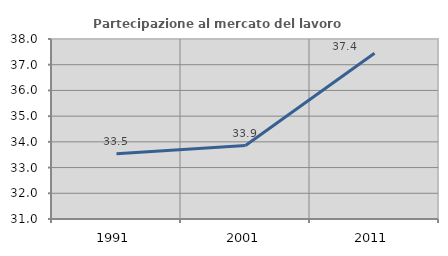
| Category | Partecipazione al mercato del lavoro  femminile |
|---|---|
| 1991.0 | 33.534 |
| 2001.0 | 33.858 |
| 2011.0 | 37.444 |